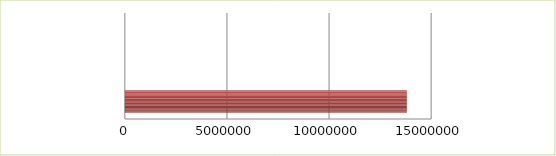
| Category | Series 0 | Series 1 |
|---|---|---|
| 0 | 2.5 | 13809394 |
| 1 | 2.6 | 0 |
| 2 | 2.7 | 0 |